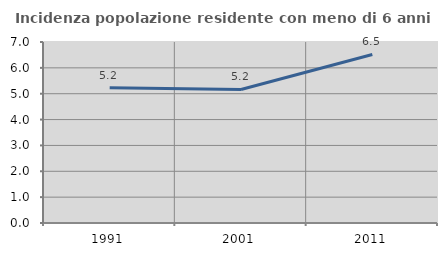
| Category | Incidenza popolazione residente con meno di 6 anni |
|---|---|
| 1991.0 | 5.228 |
| 2001.0 | 5.165 |
| 2011.0 | 6.517 |